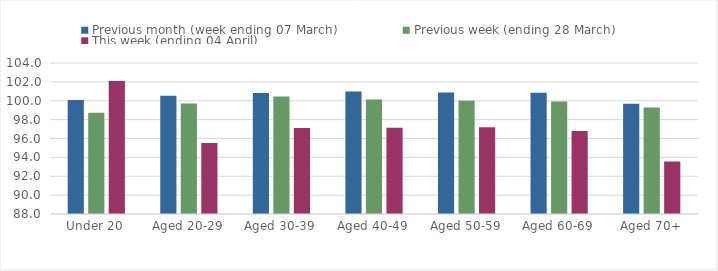
| Category | Previous month (week ending 07 March) | Previous week (ending 28 March) | This week (ending 04 April) |
|---|---|---|---|
| Under 20 | 100.071 | 98.723 | 102.084 |
| Aged 20-29 | 100.529 | 99.705 | 95.534 |
| Aged 30-39 | 100.829 | 100.445 | 97.115 |
| Aged 40-49 | 100.972 | 100.143 | 97.146 |
| Aged 50-59 | 100.88 | 99.999 | 97.188 |
| Aged 60-69 | 100.843 | 99.915 | 96.808 |
| Aged 70+ | 99.684 | 99.292 | 93.562 |